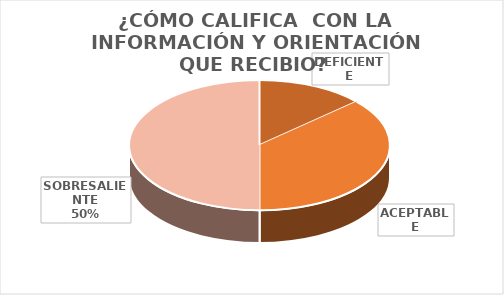
| Category | Series 0 |
|---|---|
| DEFICIENTE | 4 |
| ACEPTABLE | 11 |
| SOBRESALIENTE | 15 |